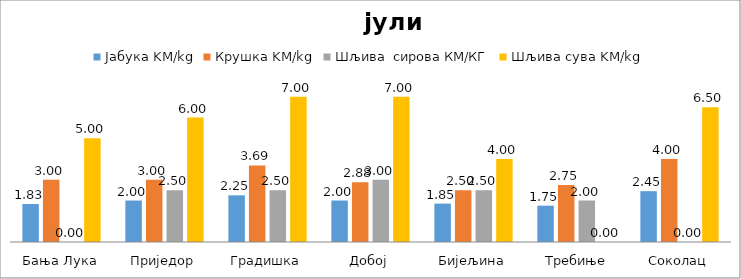
| Category | Јабука KM/kg | Крушка KM/kg | Шљива  сирова КМ/КГ | Шљива сува KM/kg |
|---|---|---|---|---|
| Бања Лука | 1.83 | 3 | 0 | 5 |
| Приједор | 2 | 3 | 2.5 | 6 |
| Градишка | 2.25 | 3.688 | 2.5 | 7 |
| Добој | 2 | 2.875 | 3 | 7 |
| Бијељина | 1.85 | 2.5 | 2.5 | 4 |
|  Требиње | 1.75 | 2.75 | 2 | 0 |
| Соколац | 2.45 | 4 | 0 | 6.5 |